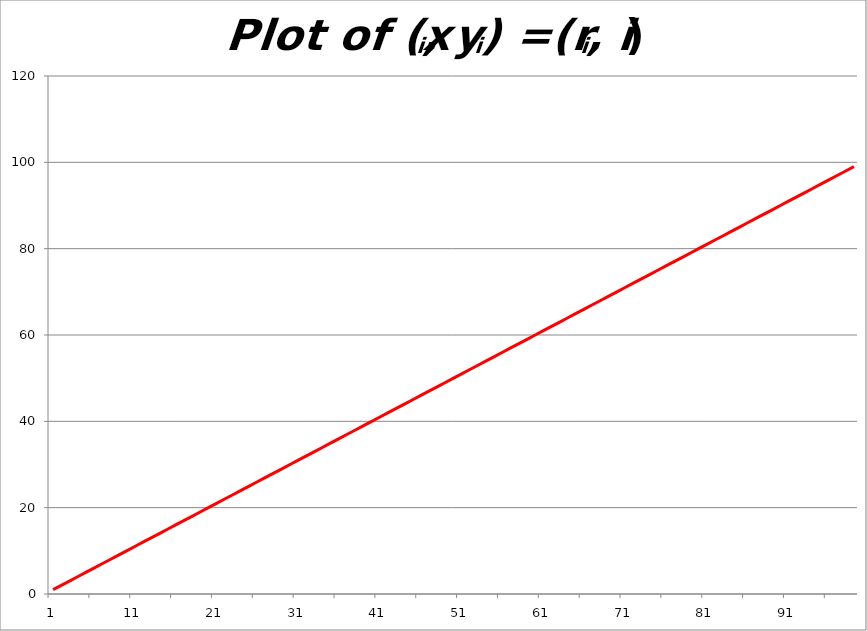
| Category | Series 0 |
|---|---|
| 0 | 1 |
| 1 | 2 |
| 2 | 3 |
| 3 | 4 |
| 4 | 5 |
| 5 | 6 |
| 6 | 7 |
| 7 | 8 |
| 8 | 9 |
| 9 | 10 |
| 10 | 11 |
| 11 | 12 |
| 12 | 13 |
| 13 | 14 |
| 14 | 15 |
| 15 | 16 |
| 16 | 17 |
| 17 | 18 |
| 18 | 19 |
| 19 | 20 |
| 20 | 21 |
| 21 | 22 |
| 22 | 23 |
| 23 | 24 |
| 24 | 25 |
| 25 | 26 |
| 26 | 27 |
| 27 | 28 |
| 28 | 29 |
| 29 | 30 |
| 30 | 31 |
| 31 | 32 |
| 32 | 33 |
| 33 | 34 |
| 34 | 35 |
| 35 | 36 |
| 36 | 37 |
| 37 | 38 |
| 38 | 39 |
| 39 | 40 |
| 40 | 41 |
| 41 | 42 |
| 42 | 43 |
| 43 | 44 |
| 44 | 45 |
| 45 | 46 |
| 46 | 47 |
| 47 | 48 |
| 48 | 49 |
| 49 | 50 |
| 50 | 51 |
| 51 | 52 |
| 52 | 53 |
| 53 | 54 |
| 54 | 55 |
| 55 | 56 |
| 56 | 57 |
| 57 | 58 |
| 58 | 59 |
| 59 | 60 |
| 60 | 61 |
| 61 | 62 |
| 62 | 63 |
| 63 | 64 |
| 64 | 65 |
| 65 | 66 |
| 66 | 67 |
| 67 | 68 |
| 68 | 69 |
| 69 | 70 |
| 70 | 71 |
| 71 | 72 |
| 72 | 73 |
| 73 | 74 |
| 74 | 75 |
| 75 | 76 |
| 76 | 77 |
| 77 | 78 |
| 78 | 79 |
| 79 | 80 |
| 80 | 81 |
| 81 | 82 |
| 82 | 83 |
| 83 | 84 |
| 84 | 85 |
| 85 | 86 |
| 86 | 87 |
| 87 | 88 |
| 88 | 89 |
| 89 | 90 |
| 90 | 91 |
| 91 | 92 |
| 92 | 93 |
| 93 | 94 |
| 94 | 95 |
| 95 | 96 |
| 96 | 97 |
| 97 | 98 |
| 98 | 99 |